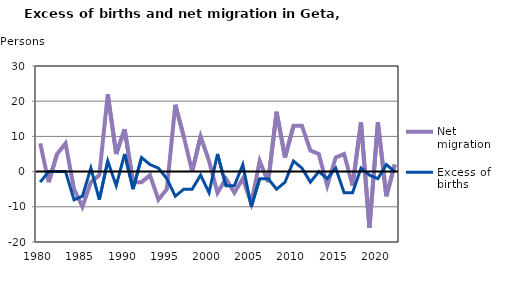
| Category | Net migration | Excess of births |
|---|---|---|
| 1980.0 | 8 | -3 |
| 1981.0 | -3 | 0 |
| 1982.0 | 5 | 0 |
| 1983.0 | 8 | 0 |
| 1984.0 | -5 | -8 |
| 1985.0 | -10 | -7 |
| 1986.0 | -3 | 1 |
| 1987.0 | -1 | -8 |
| 1988.0 | 22 | 3 |
| 1989.0 | 5 | -4 |
| 1990.0 | 12 | 5 |
| 1991.0 | -3 | -5 |
| 1992.0 | -3 | 4 |
| 1993.0 | -1 | 2 |
| 1994.0 | -8 | 1 |
| 1995.0 | -5 | -2 |
| 1996.0 | 19 | -7 |
| 1997.0 | 10 | -5 |
| 1998.0 | 0 | -5 |
| 1999.0 | 10 | -1 |
| 2000.0 | 3 | -6 |
| 2001.0 | -6 | 5 |
| 2002.0 | -2 | -4 |
| 2003.0 | -6 | -4 |
| 2004.0 | -2 | 2 |
| 2005.0 | -9 | -10 |
| 2006.0 | 3 | -2 |
| 2007.0 | -3 | -2 |
| 2008.0 | 17 | -5 |
| 2009.0 | 4 | -3 |
| 2010.0 | 13 | 3 |
| 2011.0 | 13 | 1 |
| 2012.0 | 6 | -3 |
| 2013.0 | 5 | 0 |
| 2014.0 | -4 | -2 |
| 2015.0 | 4 | 1 |
| 2016.0 | 5 | -6 |
| 2017.0 | -4 | -6 |
| 2018.0 | 14 | 1 |
| 2019.0 | -16 | -1 |
| 2020.0 | 14 | -2 |
| 2021.0 | -7 | 2 |
| 2022.0 | 2 | 0 |